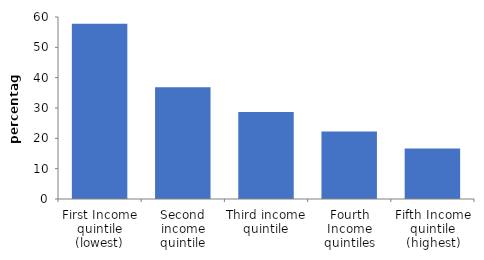
| Category | Series 0 |
|---|---|
| First Income quintile (lowest) | 57.749 |
| Second income quintile | 36.845 |
| Third income quintile | 28.688 |
| Fourth Income quintiles | 22.273 |
| Fifth Income quintile (highest) | 16.63 |